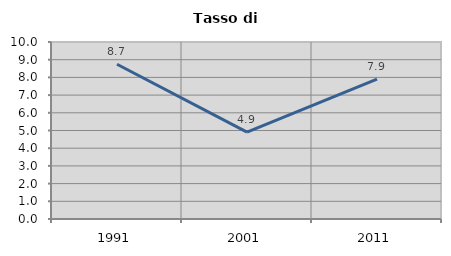
| Category | Tasso di disoccupazione   |
|---|---|
| 1991.0 | 8.743 |
| 2001.0 | 4.908 |
| 2011.0 | 7.906 |